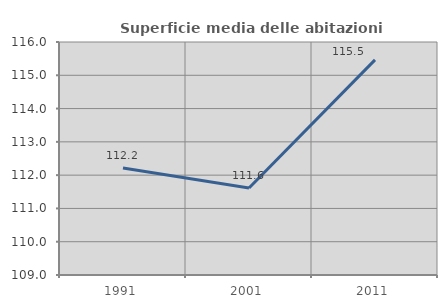
| Category | Superficie media delle abitazioni occupate |
|---|---|
| 1991.0 | 112.213 |
| 2001.0 | 111.615 |
| 2011.0 | 115.462 |